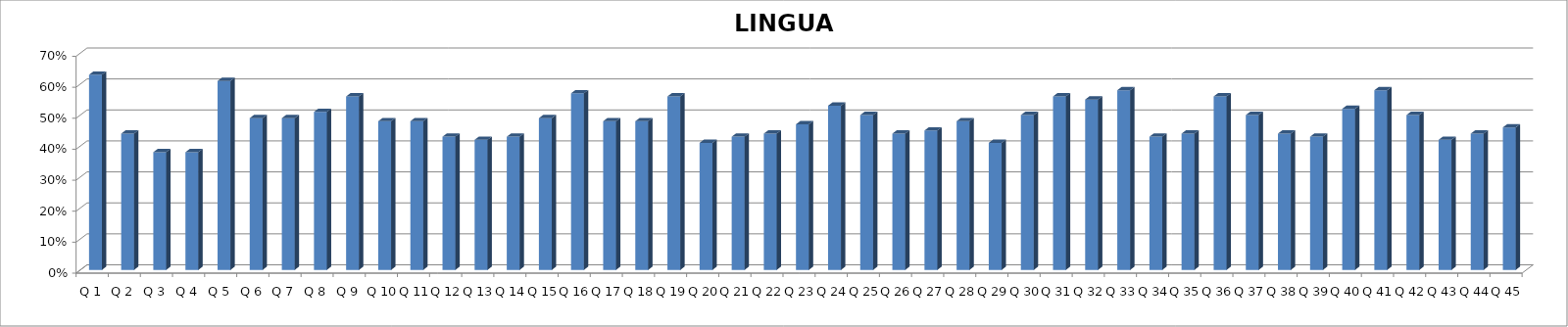
| Category | LINGUA PORTUGUESA |
|---|---|
| Q 1 | 0.63 |
| Q 2 | 0.44 |
| Q 3 | 0.38 |
| Q 4 | 0.38 |
| Q 5 | 0.61 |
| Q 6 | 0.49 |
| Q 7 | 0.49 |
| Q 8 | 0.51 |
| Q 9 | 0.56 |
| Q 10 | 0.48 |
| Q 11 | 0.48 |
| Q 12 | 0.43 |
| Q 13 | 0.42 |
| Q 14 | 0.43 |
| Q 15 | 0.49 |
| Q 16 | 0.57 |
| Q 17 | 0.48 |
| Q 18 | 0.48 |
| Q 19 | 0.56 |
| Q 20 | 0.41 |
| Q 21 | 0.43 |
| Q 22 | 0.44 |
| Q 23 | 0.47 |
| Q 24 | 0.53 |
| Q 25 | 0.5 |
| Q 26 | 0.44 |
| Q 27 | 0.45 |
| Q 28 | 0.48 |
| Q 29 | 0.41 |
| Q 30 | 0.5 |
| Q 31 | 0.56 |
| Q 32 | 0.55 |
| Q 33 | 0.58 |
| Q 34 | 0.43 |
| Q 35 | 0.44 |
| Q 36 | 0.56 |
| Q 37 | 0.5 |
| Q 38 | 0.44 |
| Q 39 | 0.43 |
| Q 40 | 0.52 |
| Q 41 | 0.58 |
| Q 42 | 0.5 |
| Q 43 | 0.42 |
| Q 44 | 0.44 |
| Q 45 | 0.46 |